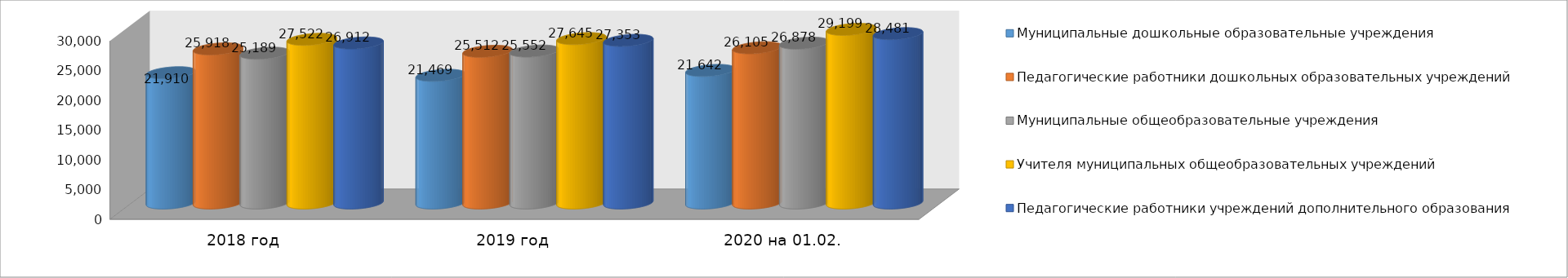
| Category | Муниципальные дошкольные образовательные учреждения | Педагогические работники дошкольных образовательных учреждений | Муниципальные общеобразовательные учреждения | Учителя муниципальных общеобразовательных учреждений | Педагогические работники учреждений дополнительного образования |
|---|---|---|---|---|---|
| 2018 год | 21910 | 25918 | 25189 | 27522 | 26912 |
| 2019 год | 21469 | 25512 | 25552 | 27645 | 27353 |
| 2020 на 01.02. | 22293 | 26105 | 26878 | 29199 | 28481 |